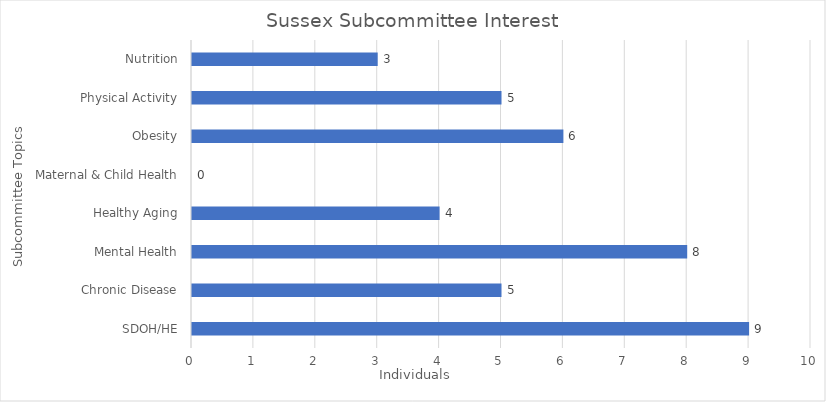
| Category | Series 0 |
|---|---|
| SDOH/HE | 9 |
| Chronic Disease | 5 |
| Mental Health | 8 |
| Healthy Aging | 4 |
| Maternal & Child Health | 0 |
| Obesity | 6 |
| Physical Activity | 5 |
| Nutrition | 3 |